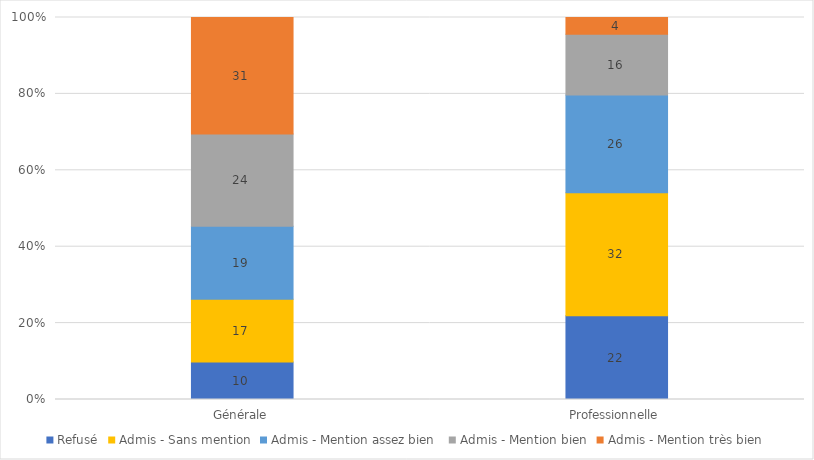
| Category | Refusé | Admis - Sans mention | Admis - Mention assez bien  | Admis - Mention bien | Admis - Mention très bien |
|---|---|---|---|---|---|
| Générale | 9.8 | 16.5 | 19.1 | 24.2 | 30.5 |
| Professionnelle | 21.9 | 32.2 | 25.6 | 15.9 | 4.4 |